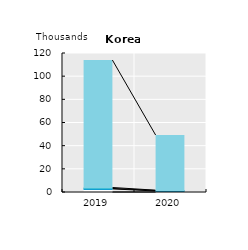
| Category | International seasonal workers | Working holidaymakers | Intra-company transferees | International trainees | Other temporary migrant workers |
|---|---|---|---|---|---|
| 2019.0 |  | 2.678 | 0.4 | 0.811 | 110.04 |
| 2020.0 |  | 0.875 | 0.408 | 0.295 | 47.625 |